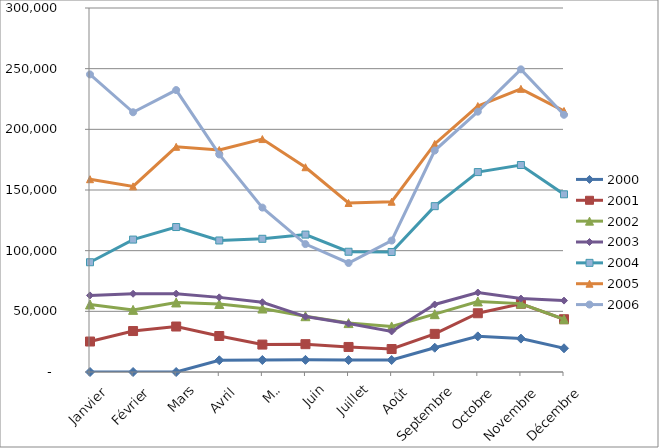
| Category | 2000 | 2001 | 2002 | 2003 | 2004 | 2005 | 2006 |
|---|---|---|---|---|---|---|---|
| Janvier | 0 | 25114 | 55681 | 63125 | 90464 | 158904 | 245257 |
| Février | 0 | 33760 | 51209 | 64499 | 109133 | 152995 | 214057 |
| Mars | 0 | 37482 | 57313 | 64575 | 119479 | 185598 | 232372 |
| Avril | 9669 | 29660 | 56068 | 61505 | 108401 | 182968 | 179292 |
| Mai | 9886 | 22613 | 52313 | 57493 | 109784 | 191978 | 135494 |
| Juin | 10003 | 22938.206 | 45997 | 45678 | 113251 | 168771 | 105438 |
| Juillet | 9803 | 20633 | 40318 | 39907 | 99119 | 139307 | 89839 |
| Août | 9882 | 18936 | 37546 | 33434 | 98922 | 140337 | 108340 |
| Septembre | 20005 | 31414 | 47670 | 55634 | 136684 | 187965 | 182533 |
| Octobre | 29367 | 48431 | 58126 | 65485 | 164769 | 219196 | 214559 |
| Novembre | 27517 | 56240 | 56357 | 60523 | 170600 | 233370 | 249440 |
| Décembre | 19552 | 43494 | 43518 | 58850 | 146468 | 215134 | 212000 |